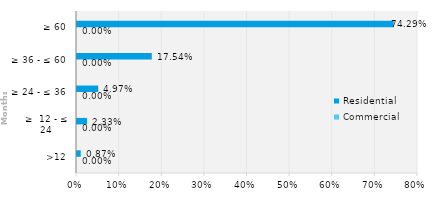
| Category | Commercial | Residential |
|---|---|---|
| >12 | 0 | 0.009 |
| ≥  12 - ≤ 24 | 0 | 0.023 |
| ≥ 24 - ≤ 36 | 0 | 0.05 |
| ≥ 36 - ≤ 60 | 0 | 0.175 |
| ≥ 60 | 0 | 0.743 |